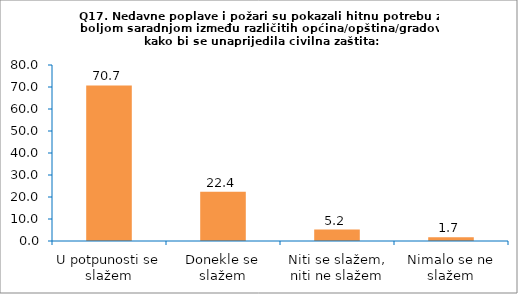
| Category | Series 0 |
|---|---|
| U potpunosti se slažem | 70.69 |
| Donekle se slažem | 22.414 |
| Niti se slažem, niti ne slažem | 5.172 |
| Nimalo se ne slažem | 1.724 |